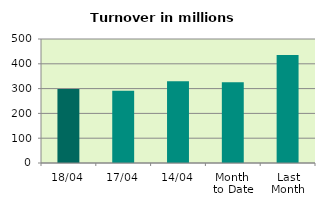
| Category | Series 0 |
|---|---|
| 18/04 | 298.679 |
| 17/04 | 291.501 |
| 14/04 | 329.869 |
| Month 
to Date | 325.763 |
| Last
Month | 435.216 |